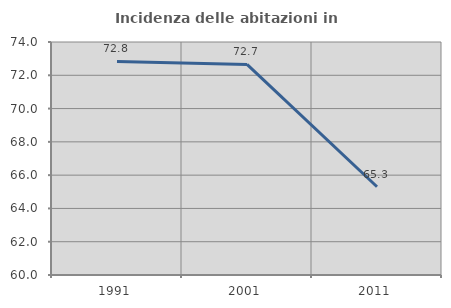
| Category | Incidenza delle abitazioni in proprietà  |
|---|---|
| 1991.0 | 72.834 |
| 2001.0 | 72.654 |
| 2011.0 | 65.302 |